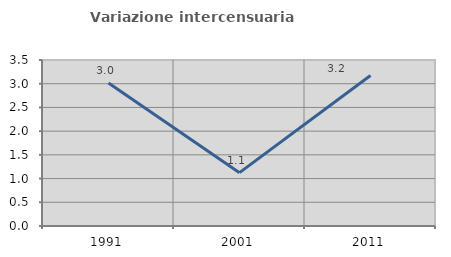
| Category | Variazione intercensuaria annua |
|---|---|
| 1991.0 | 3.013 |
| 2001.0 | 1.125 |
| 2011.0 | 3.175 |